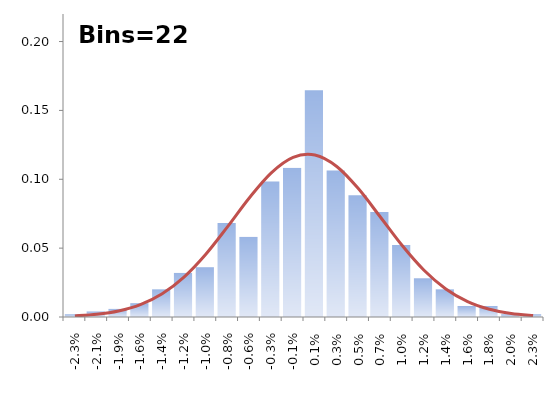
| Category | Series 0 |
|---|---|
| -0.02296314036142868 | 0.002 |
| -0.020797993215183254 | 0.004 |
| -0.01863284606893783 | 0.006 |
| -0.016467698922692404 | 0.01 |
| -0.01430255177644698 | 0.02 |
| -0.012137404630201559 | 0.032 |
| -0.009972257483956136 | 0.036 |
| -0.007807110337710709 | 0.068 |
| -0.005641963191465286 | 0.058 |
| -0.003476816045219863 | 0.098 |
| -0.0013116688989744394 | 0.108 |
| 0.0008534782472709836 | 0.165 |
| 0.0030186253935164074 | 0.106 |
| 0.00518377253976183 | 0.088 |
| 0.007348919686007253 | 0.076 |
| 0.009514066832252678 | 0.052 |
| 0.011679213978498103 | 0.028 |
| 0.013844361124743526 | 0.02 |
| 0.016009508270988952 | 0.008 |
| 0.01817465541723437 | 0.008 |
| 0.020339802563479795 | 0.002 |
| 0.02250494970972522 | 0.002 |